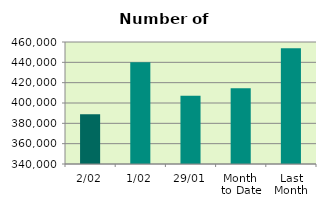
| Category | Series 0 |
|---|---|
| 2/02 | 388994 |
| 1/02 | 440132 |
| 29/01 | 407160 |
| Month 
to Date | 414563 |
| Last
Month | 453736.6 |